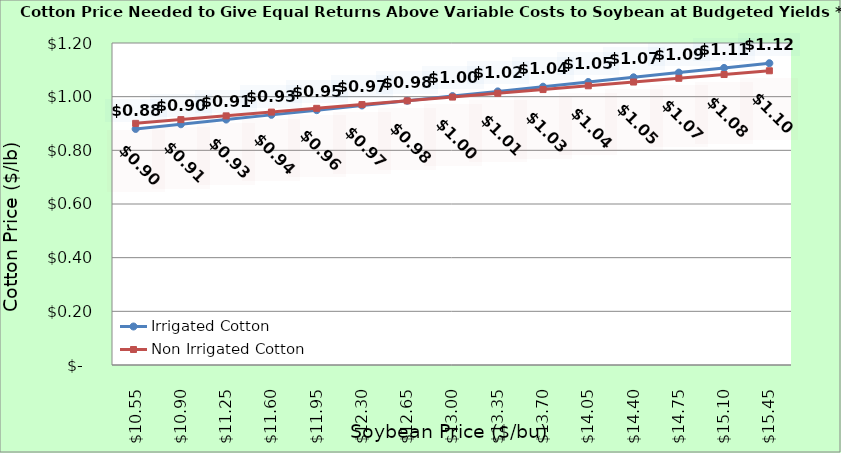
| Category | Irrigated Cotton | Non Irrigated Cotton |
|---|---|---|
| 10.550000000000002 | 0.88 | 0.901 |
| 10.900000000000002 | 0.897 | 0.915 |
| 11.250000000000002 | 0.915 | 0.929 |
| 11.600000000000001 | 0.932 | 0.943 |
| 11.950000000000001 | 0.95 | 0.957 |
| 12.3 | 0.967 | 0.971 |
| 12.65 | 0.985 | 0.985 |
| 13.0 | 1.002 | 0.999 |
| 13.35 | 1.02 | 1.013 |
| 13.7 | 1.037 | 1.027 |
| 14.049999999999999 | 1.055 | 1.041 |
| 14.399999999999999 | 1.072 | 1.055 |
| 14.749999999999998 | 1.09 | 1.069 |
| 15.099999999999998 | 1.107 | 1.083 |
| 15.449999999999998 | 1.125 | 1.097 |